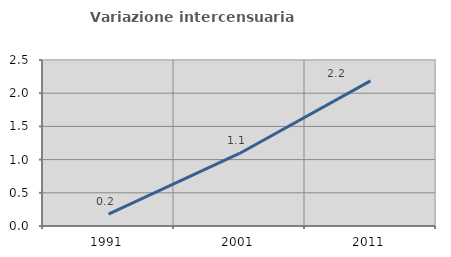
| Category | Variazione intercensuaria annua |
|---|---|
| 1991.0 | 0.179 |
| 2001.0 | 1.093 |
| 2011.0 | 2.185 |